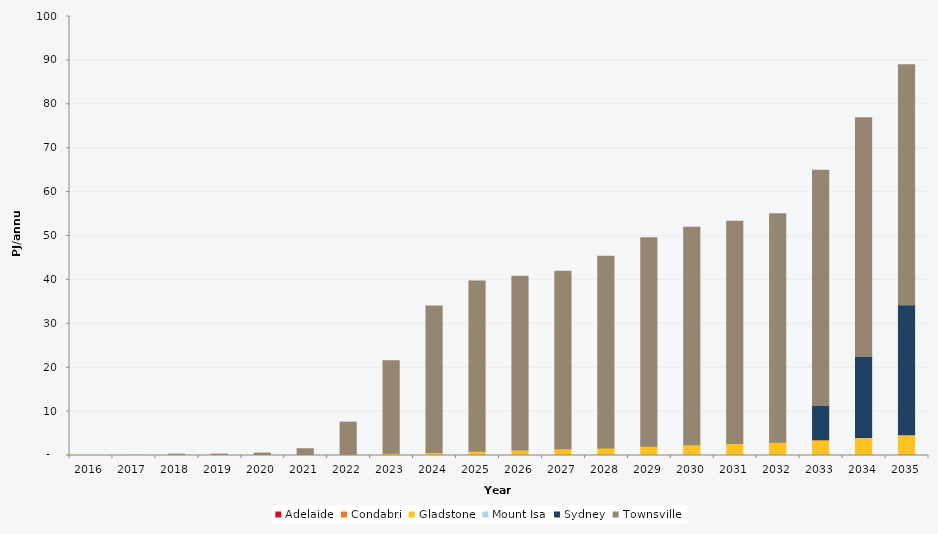
| Category | Adelaide | Condabri | Gladstone | Mount Isa | Sydney | Townsville |
|---|---|---|---|---|---|---|
| 2016.0 | 0 | 0 | 0 | 0 | 0 | 0 |
| 2017.0 | 0 | 0 | 0 | 0 | 0 | 0.036 |
| 2018.0 | 0 | 0 | 0 | 0 | 0 | 0.303 |
| 2019.0 | 0 | 0 | 0.005 | 0 | 0 | 0.315 |
| 2020.0 | 0 | 0 | 0.01 | 0 | 0 | 0.535 |
| 2021.0 | 0 | 0 | 0.076 | 0 | 0 | 1.462 |
| 2022.0 | 0 | 0 | 0.252 | 0 | 0 | 7.348 |
| 2023.0 | 0 | 0 | 0.494 | 0 | 0 | 21.084 |
| 2024.0 | 0 | 0 | 0.676 | 0 | 0 | 33.396 |
| 2025.0 | 0 | 0 | 0.961 | 0 | 0 | 38.763 |
| 2026.0 | 0 | 0 | 1.224 | 0 | 0 | 39.587 |
| 2027.0 | 0 | 0 | 1.511 | 0 | 0 | 40.46 |
| 2028.0 | 0 | 0 | 1.71 | 0 | 0 | 43.692 |
| 2029.0 | 0 | 0 | 2.124 | 0 | 0 | 47.504 |
| 2030.0 | 0.009 | 0 | 2.42 | 0 | 0 | 49.551 |
| 2031.0 | 0.042 | 0 | 2.715 | 0 | 0 | 50.582 |
| 2032.0 | 0.071 | 0 | 2.952 | 0 | 0 | 52.033 |
| 2033.0 | 0.044 | 0 | 3.526 | 0 | 7.822 | 53.574 |
| 2034.0 | 0.103 | 0 | 3.98 | 0 | 18.476 | 54.383 |
| 2035.0 | 0.251 | 0.028 | 4.435 | 0.004 | 29.549 | 54.715 |